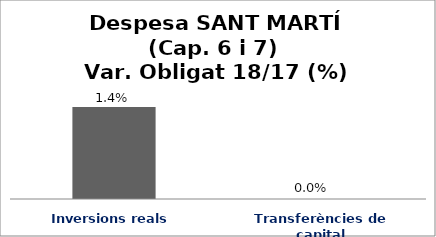
| Category | Series 0 |
|---|---|
| Inversions reals | 0.014 |
| Transferències de capital | 0 |